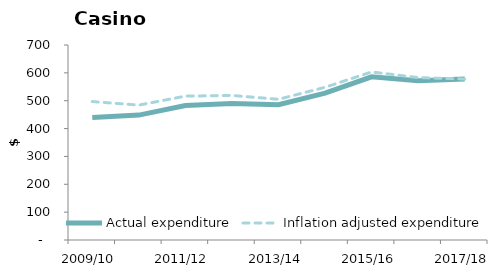
| Category | Actual expenditure | Inflation adjusted expenditure |
|---|---|---|
| 2009/10 | 439.795 | 496.968 |
| 2010/11 | 448.337 | 484.203 |
| 2011/12 | 482.662 | 516.449 |
| 2012/13 | 489.573 | 518.948 |
| 2013/14 | 485.655 | 505.081 |
| 2014/15 | 527.104 | 548.188 |
| 2015/16 | 585.622 | 603.19 |
| 2016/17 | 571.568 | 582.999 |
| 2017/18 | 577.899 | 577.899 |